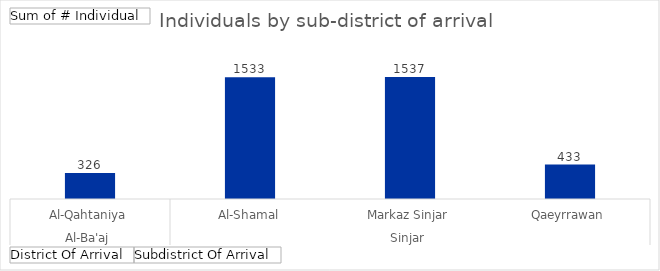
| Category | Total |
|---|---|
| 0 | 326 |
| 1 | 1533 |
| 2 | 1537 |
| 3 | 433 |